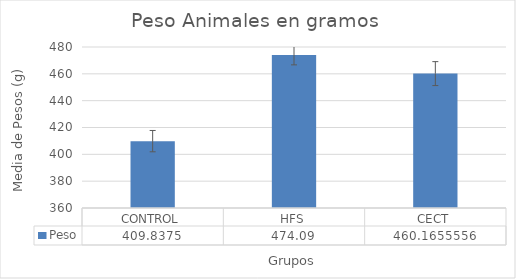
| Category | Peso  |
|---|---|
| CONTROL | 409.838 |
| HFS | 474.09 |
| CECT | 460.166 |